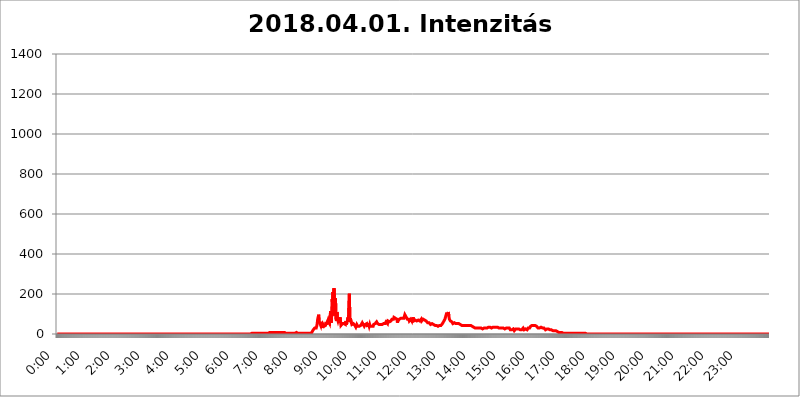
| Category | 2018.04.01. Intenzitás [W/m^2] |
|---|---|
| 0.0 | 0 |
| 0.0006944444444444445 | 0 |
| 0.001388888888888889 | 0 |
| 0.0020833333333333333 | 0 |
| 0.002777777777777778 | 0 |
| 0.003472222222222222 | 0 |
| 0.004166666666666667 | 0 |
| 0.004861111111111111 | 0 |
| 0.005555555555555556 | 0 |
| 0.0062499999999999995 | 0 |
| 0.006944444444444444 | 0 |
| 0.007638888888888889 | 0 |
| 0.008333333333333333 | 0 |
| 0.009027777777777779 | 0 |
| 0.009722222222222222 | 0 |
| 0.010416666666666666 | 0 |
| 0.011111111111111112 | 0 |
| 0.011805555555555555 | 0 |
| 0.012499999999999999 | 0 |
| 0.013194444444444444 | 0 |
| 0.013888888888888888 | 0 |
| 0.014583333333333332 | 0 |
| 0.015277777777777777 | 0 |
| 0.015972222222222224 | 0 |
| 0.016666666666666666 | 0 |
| 0.017361111111111112 | 0 |
| 0.018055555555555557 | 0 |
| 0.01875 | 0 |
| 0.019444444444444445 | 0 |
| 0.02013888888888889 | 0 |
| 0.020833333333333332 | 0 |
| 0.02152777777777778 | 0 |
| 0.022222222222222223 | 0 |
| 0.02291666666666667 | 0 |
| 0.02361111111111111 | 0 |
| 0.024305555555555556 | 0 |
| 0.024999999999999998 | 0 |
| 0.025694444444444447 | 0 |
| 0.02638888888888889 | 0 |
| 0.027083333333333334 | 0 |
| 0.027777777777777776 | 0 |
| 0.02847222222222222 | 0 |
| 0.029166666666666664 | 0 |
| 0.029861111111111113 | 0 |
| 0.030555555555555555 | 0 |
| 0.03125 | 0 |
| 0.03194444444444445 | 0 |
| 0.03263888888888889 | 0 |
| 0.03333333333333333 | 0 |
| 0.034027777777777775 | 0 |
| 0.034722222222222224 | 0 |
| 0.035416666666666666 | 0 |
| 0.036111111111111115 | 0 |
| 0.03680555555555556 | 0 |
| 0.0375 | 0 |
| 0.03819444444444444 | 0 |
| 0.03888888888888889 | 0 |
| 0.03958333333333333 | 0 |
| 0.04027777777777778 | 0 |
| 0.04097222222222222 | 0 |
| 0.041666666666666664 | 0 |
| 0.042361111111111106 | 0 |
| 0.04305555555555556 | 0 |
| 0.043750000000000004 | 0 |
| 0.044444444444444446 | 0 |
| 0.04513888888888889 | 0 |
| 0.04583333333333334 | 0 |
| 0.04652777777777778 | 0 |
| 0.04722222222222222 | 0 |
| 0.04791666666666666 | 0 |
| 0.04861111111111111 | 0 |
| 0.049305555555555554 | 0 |
| 0.049999999999999996 | 0 |
| 0.05069444444444445 | 0 |
| 0.051388888888888894 | 0 |
| 0.052083333333333336 | 0 |
| 0.05277777777777778 | 0 |
| 0.05347222222222222 | 0 |
| 0.05416666666666667 | 0 |
| 0.05486111111111111 | 0 |
| 0.05555555555555555 | 0 |
| 0.05625 | 0 |
| 0.05694444444444444 | 0 |
| 0.057638888888888885 | 0 |
| 0.05833333333333333 | 0 |
| 0.05902777777777778 | 0 |
| 0.059722222222222225 | 0 |
| 0.06041666666666667 | 0 |
| 0.061111111111111116 | 0 |
| 0.06180555555555556 | 0 |
| 0.0625 | 0 |
| 0.06319444444444444 | 0 |
| 0.06388888888888888 | 0 |
| 0.06458333333333334 | 0 |
| 0.06527777777777778 | 0 |
| 0.06597222222222222 | 0 |
| 0.06666666666666667 | 0 |
| 0.06736111111111111 | 0 |
| 0.06805555555555555 | 0 |
| 0.06874999999999999 | 0 |
| 0.06944444444444443 | 0 |
| 0.07013888888888889 | 0 |
| 0.07083333333333333 | 0 |
| 0.07152777777777779 | 0 |
| 0.07222222222222223 | 0 |
| 0.07291666666666667 | 0 |
| 0.07361111111111111 | 0 |
| 0.07430555555555556 | 0 |
| 0.075 | 0 |
| 0.07569444444444444 | 0 |
| 0.0763888888888889 | 0 |
| 0.07708333333333334 | 0 |
| 0.07777777777777778 | 0 |
| 0.07847222222222222 | 0 |
| 0.07916666666666666 | 0 |
| 0.0798611111111111 | 0 |
| 0.08055555555555556 | 0 |
| 0.08125 | 0 |
| 0.08194444444444444 | 0 |
| 0.08263888888888889 | 0 |
| 0.08333333333333333 | 0 |
| 0.08402777777777777 | 0 |
| 0.08472222222222221 | 0 |
| 0.08541666666666665 | 0 |
| 0.08611111111111112 | 0 |
| 0.08680555555555557 | 0 |
| 0.08750000000000001 | 0 |
| 0.08819444444444445 | 0 |
| 0.08888888888888889 | 0 |
| 0.08958333333333333 | 0 |
| 0.09027777777777778 | 0 |
| 0.09097222222222222 | 0 |
| 0.09166666666666667 | 0 |
| 0.09236111111111112 | 0 |
| 0.09305555555555556 | 0 |
| 0.09375 | 0 |
| 0.09444444444444444 | 0 |
| 0.09513888888888888 | 0 |
| 0.09583333333333333 | 0 |
| 0.09652777777777777 | 0 |
| 0.09722222222222222 | 0 |
| 0.09791666666666667 | 0 |
| 0.09861111111111111 | 0 |
| 0.09930555555555555 | 0 |
| 0.09999999999999999 | 0 |
| 0.10069444444444443 | 0 |
| 0.1013888888888889 | 0 |
| 0.10208333333333335 | 0 |
| 0.10277777777777779 | 0 |
| 0.10347222222222223 | 0 |
| 0.10416666666666667 | 0 |
| 0.10486111111111111 | 0 |
| 0.10555555555555556 | 0 |
| 0.10625 | 0 |
| 0.10694444444444444 | 0 |
| 0.1076388888888889 | 0 |
| 0.10833333333333334 | 0 |
| 0.10902777777777778 | 0 |
| 0.10972222222222222 | 0 |
| 0.1111111111111111 | 0 |
| 0.11180555555555556 | 0 |
| 0.11180555555555556 | 0 |
| 0.1125 | 0 |
| 0.11319444444444444 | 0 |
| 0.11388888888888889 | 0 |
| 0.11458333333333333 | 0 |
| 0.11527777777777777 | 0 |
| 0.11597222222222221 | 0 |
| 0.11666666666666665 | 0 |
| 0.1173611111111111 | 0 |
| 0.11805555555555557 | 0 |
| 0.11944444444444445 | 0 |
| 0.12013888888888889 | 0 |
| 0.12083333333333333 | 0 |
| 0.12152777777777778 | 0 |
| 0.12222222222222223 | 0 |
| 0.12291666666666667 | 0 |
| 0.12291666666666667 | 0 |
| 0.12361111111111112 | 0 |
| 0.12430555555555556 | 0 |
| 0.125 | 0 |
| 0.12569444444444444 | 0 |
| 0.12638888888888888 | 0 |
| 0.12708333333333333 | 0 |
| 0.16875 | 0 |
| 0.12847222222222224 | 0 |
| 0.12916666666666668 | 0 |
| 0.12986111111111112 | 0 |
| 0.13055555555555556 | 0 |
| 0.13125 | 0 |
| 0.13194444444444445 | 0 |
| 0.1326388888888889 | 0 |
| 0.13333333333333333 | 0 |
| 0.13402777777777777 | 0 |
| 0.13402777777777777 | 0 |
| 0.13472222222222222 | 0 |
| 0.13541666666666666 | 0 |
| 0.1361111111111111 | 0 |
| 0.13749999999999998 | 0 |
| 0.13819444444444443 | 0 |
| 0.1388888888888889 | 0 |
| 0.13958333333333334 | 0 |
| 0.14027777777777778 | 0 |
| 0.14097222222222222 | 0 |
| 0.14166666666666666 | 0 |
| 0.1423611111111111 | 0 |
| 0.14305555555555557 | 0 |
| 0.14375000000000002 | 0 |
| 0.14444444444444446 | 0 |
| 0.1451388888888889 | 0 |
| 0.1451388888888889 | 0 |
| 0.14652777777777778 | 0 |
| 0.14722222222222223 | 0 |
| 0.14791666666666667 | 0 |
| 0.1486111111111111 | 0 |
| 0.14930555555555555 | 0 |
| 0.15 | 0 |
| 0.15069444444444444 | 0 |
| 0.15138888888888888 | 0 |
| 0.15208333333333332 | 0 |
| 0.15277777777777776 | 0 |
| 0.15347222222222223 | 0 |
| 0.15416666666666667 | 0 |
| 0.15486111111111112 | 0 |
| 0.15555555555555556 | 0 |
| 0.15625 | 0 |
| 0.15694444444444444 | 0 |
| 0.15763888888888888 | 0 |
| 0.15833333333333333 | 0 |
| 0.15902777777777777 | 0 |
| 0.15972222222222224 | 0 |
| 0.16041666666666668 | 0 |
| 0.16111111111111112 | 0 |
| 0.16180555555555556 | 0 |
| 0.1625 | 0 |
| 0.16319444444444445 | 0 |
| 0.1638888888888889 | 0 |
| 0.16458333333333333 | 0 |
| 0.16527777777777777 | 0 |
| 0.16597222222222222 | 0 |
| 0.16666666666666666 | 0 |
| 0.1673611111111111 | 0 |
| 0.16805555555555554 | 0 |
| 0.16874999999999998 | 0 |
| 0.16944444444444443 | 0 |
| 0.17013888888888887 | 0 |
| 0.1708333333333333 | 0 |
| 0.17152777777777775 | 0 |
| 0.17222222222222225 | 0 |
| 0.1729166666666667 | 0 |
| 0.17361111111111113 | 0 |
| 0.17430555555555557 | 0 |
| 0.17500000000000002 | 0 |
| 0.17569444444444446 | 0 |
| 0.1763888888888889 | 0 |
| 0.17708333333333334 | 0 |
| 0.17777777777777778 | 0 |
| 0.17847222222222223 | 0 |
| 0.17916666666666667 | 0 |
| 0.1798611111111111 | 0 |
| 0.18055555555555555 | 0 |
| 0.18125 | 0 |
| 0.18194444444444444 | 0 |
| 0.1826388888888889 | 0 |
| 0.18333333333333335 | 0 |
| 0.1840277777777778 | 0 |
| 0.18472222222222223 | 0 |
| 0.18541666666666667 | 0 |
| 0.18611111111111112 | 0 |
| 0.18680555555555556 | 0 |
| 0.1875 | 0 |
| 0.18819444444444444 | 0 |
| 0.18888888888888888 | 0 |
| 0.18958333333333333 | 0 |
| 0.19027777777777777 | 0 |
| 0.1909722222222222 | 0 |
| 0.19166666666666665 | 0 |
| 0.19236111111111112 | 0 |
| 0.19305555555555554 | 0 |
| 0.19375 | 0 |
| 0.19444444444444445 | 0 |
| 0.1951388888888889 | 0 |
| 0.19583333333333333 | 0 |
| 0.19652777777777777 | 0 |
| 0.19722222222222222 | 0 |
| 0.19791666666666666 | 0 |
| 0.1986111111111111 | 0 |
| 0.19930555555555554 | 0 |
| 0.19999999999999998 | 0 |
| 0.20069444444444443 | 0 |
| 0.20138888888888887 | 0 |
| 0.2020833333333333 | 0 |
| 0.2027777777777778 | 0 |
| 0.2034722222222222 | 0 |
| 0.2041666666666667 | 0 |
| 0.20486111111111113 | 0 |
| 0.20555555555555557 | 0 |
| 0.20625000000000002 | 0 |
| 0.20694444444444446 | 0 |
| 0.2076388888888889 | 0 |
| 0.20833333333333334 | 0 |
| 0.20902777777777778 | 0 |
| 0.20972222222222223 | 0 |
| 0.21041666666666667 | 0 |
| 0.2111111111111111 | 0 |
| 0.21180555555555555 | 0 |
| 0.2125 | 0 |
| 0.21319444444444444 | 0 |
| 0.2138888888888889 | 0 |
| 0.21458333333333335 | 0 |
| 0.2152777777777778 | 0 |
| 0.21597222222222223 | 0 |
| 0.21666666666666667 | 0 |
| 0.21736111111111112 | 0 |
| 0.21805555555555556 | 0 |
| 0.21875 | 0 |
| 0.21944444444444444 | 0 |
| 0.22013888888888888 | 0 |
| 0.22083333333333333 | 0 |
| 0.22152777777777777 | 0 |
| 0.2222222222222222 | 0 |
| 0.22291666666666665 | 0 |
| 0.2236111111111111 | 0 |
| 0.22430555555555556 | 0 |
| 0.225 | 0 |
| 0.22569444444444445 | 0 |
| 0.2263888888888889 | 0 |
| 0.22708333333333333 | 0 |
| 0.22777777777777777 | 0 |
| 0.22847222222222222 | 0 |
| 0.22916666666666666 | 0 |
| 0.2298611111111111 | 0 |
| 0.23055555555555554 | 0 |
| 0.23124999999999998 | 0 |
| 0.23194444444444443 | 0 |
| 0.23263888888888887 | 0 |
| 0.2333333333333333 | 0 |
| 0.2340277777777778 | 0 |
| 0.2347222222222222 | 0 |
| 0.2354166666666667 | 0 |
| 0.23611111111111113 | 0 |
| 0.23680555555555557 | 0 |
| 0.23750000000000002 | 0 |
| 0.23819444444444446 | 0 |
| 0.2388888888888889 | 0 |
| 0.23958333333333334 | 0 |
| 0.24027777777777778 | 0 |
| 0.24097222222222223 | 0 |
| 0.24166666666666667 | 0 |
| 0.2423611111111111 | 0 |
| 0.24305555555555555 | 0 |
| 0.24375 | 0 |
| 0.24444444444444446 | 0 |
| 0.24513888888888888 | 0 |
| 0.24583333333333335 | 0 |
| 0.2465277777777778 | 0 |
| 0.24722222222222223 | 0 |
| 0.24791666666666667 | 0 |
| 0.24861111111111112 | 0 |
| 0.24930555555555556 | 0 |
| 0.25 | 0 |
| 0.25069444444444444 | 0 |
| 0.2513888888888889 | 0 |
| 0.2520833333333333 | 0 |
| 0.25277777777777777 | 0 |
| 0.2534722222222222 | 0 |
| 0.25416666666666665 | 0 |
| 0.2548611111111111 | 0 |
| 0.2555555555555556 | 0 |
| 0.25625000000000003 | 0 |
| 0.2569444444444445 | 0 |
| 0.2576388888888889 | 0 |
| 0.25833333333333336 | 0 |
| 0.2590277777777778 | 0 |
| 0.25972222222222224 | 0 |
| 0.2604166666666667 | 0 |
| 0.2611111111111111 | 0 |
| 0.26180555555555557 | 0 |
| 0.2625 | 0 |
| 0.26319444444444445 | 0 |
| 0.2638888888888889 | 0 |
| 0.26458333333333334 | 0 |
| 0.2652777777777778 | 0 |
| 0.2659722222222222 | 0 |
| 0.26666666666666666 | 0 |
| 0.2673611111111111 | 0 |
| 0.26805555555555555 | 0 |
| 0.26875 | 0 |
| 0.26944444444444443 | 0 |
| 0.2701388888888889 | 0 |
| 0.2708333333333333 | 0 |
| 0.27152777777777776 | 0 |
| 0.2722222222222222 | 3.525 |
| 0.27291666666666664 | 3.525 |
| 0.2736111111111111 | 0 |
| 0.2743055555555555 | 3.525 |
| 0.27499999999999997 | 3.525 |
| 0.27569444444444446 | 3.525 |
| 0.27638888888888885 | 3.525 |
| 0.27708333333333335 | 3.525 |
| 0.2777777777777778 | 3.525 |
| 0.27847222222222223 | 3.525 |
| 0.2791666666666667 | 3.525 |
| 0.2798611111111111 | 3.525 |
| 0.28055555555555556 | 3.525 |
| 0.28125 | 3.525 |
| 0.28194444444444444 | 3.525 |
| 0.2826388888888889 | 3.525 |
| 0.2833333333333333 | 3.525 |
| 0.28402777777777777 | 3.525 |
| 0.2847222222222222 | 3.525 |
| 0.28541666666666665 | 3.525 |
| 0.28611111111111115 | 3.525 |
| 0.28680555555555554 | 3.525 |
| 0.28750000000000003 | 3.525 |
| 0.2881944444444445 | 3.525 |
| 0.2888888888888889 | 3.525 |
| 0.28958333333333336 | 3.525 |
| 0.2902777777777778 | 3.525 |
| 0.29097222222222224 | 3.525 |
| 0.2916666666666667 | 3.525 |
| 0.2923611111111111 | 3.525 |
| 0.29305555555555557 | 3.525 |
| 0.29375 | 3.525 |
| 0.29444444444444445 | 3.525 |
| 0.2951388888888889 | 3.525 |
| 0.29583333333333334 | 3.525 |
| 0.2965277777777778 | 3.525 |
| 0.2972222222222222 | 3.525 |
| 0.29791666666666666 | 7.887 |
| 0.2986111111111111 | 7.887 |
| 0.29930555555555555 | 7.887 |
| 0.3 | 7.887 |
| 0.30069444444444443 | 7.887 |
| 0.3013888888888889 | 7.887 |
| 0.3020833333333333 | 7.887 |
| 0.30277777777777776 | 7.887 |
| 0.3034722222222222 | 7.887 |
| 0.30416666666666664 | 7.887 |
| 0.3048611111111111 | 7.887 |
| 0.3055555555555555 | 7.887 |
| 0.30624999999999997 | 7.887 |
| 0.3069444444444444 | 7.887 |
| 0.3076388888888889 | 7.887 |
| 0.30833333333333335 | 7.887 |
| 0.3090277777777778 | 7.887 |
| 0.30972222222222223 | 7.887 |
| 0.3104166666666667 | 7.887 |
| 0.3111111111111111 | 7.887 |
| 0.31180555555555556 | 7.887 |
| 0.3125 | 7.887 |
| 0.31319444444444444 | 3.525 |
| 0.3138888888888889 | 7.887 |
| 0.3145833333333333 | 7.887 |
| 0.31527777777777777 | 7.887 |
| 0.3159722222222222 | 7.887 |
| 0.31666666666666665 | 7.887 |
| 0.31736111111111115 | 3.525 |
| 0.31805555555555554 | 7.887 |
| 0.31875000000000003 | 7.887 |
| 0.3194444444444445 | 7.887 |
| 0.3201388888888889 | 7.887 |
| 0.32083333333333336 | 3.525 |
| 0.3215277777777778 | 3.525 |
| 0.32222222222222224 | 3.525 |
| 0.3229166666666667 | 3.525 |
| 0.3236111111111111 | 3.525 |
| 0.32430555555555557 | 3.525 |
| 0.325 | 3.525 |
| 0.32569444444444445 | 3.525 |
| 0.3263888888888889 | 3.525 |
| 0.32708333333333334 | 3.525 |
| 0.3277777777777778 | 3.525 |
| 0.3284722222222222 | 3.525 |
| 0.32916666666666666 | 3.525 |
| 0.3298611111111111 | 3.525 |
| 0.33055555555555555 | 3.525 |
| 0.33125 | 3.525 |
| 0.33194444444444443 | 3.525 |
| 0.3326388888888889 | 7.887 |
| 0.3333333333333333 | 3.525 |
| 0.3340277777777778 | 7.887 |
| 0.3347222222222222 | 7.887 |
| 0.3354166666666667 | 7.887 |
| 0.3361111111111111 | 3.525 |
| 0.3368055555555556 | 3.525 |
| 0.33749999999999997 | 3.525 |
| 0.33819444444444446 | 3.525 |
| 0.33888888888888885 | 3.525 |
| 0.33958333333333335 | 3.525 |
| 0.34027777777777773 | 3.525 |
| 0.34097222222222223 | 3.525 |
| 0.3416666666666666 | 3.525 |
| 0.3423611111111111 | 3.525 |
| 0.3430555555555555 | 3.525 |
| 0.34375 | 3.525 |
| 0.3444444444444445 | 3.525 |
| 0.3451388888888889 | 3.525 |
| 0.3458333333333334 | 3.525 |
| 0.34652777777777777 | 3.525 |
| 0.34722222222222227 | 3.525 |
| 0.34791666666666665 | 3.525 |
| 0.34861111111111115 | 3.525 |
| 0.34930555555555554 | 3.525 |
| 0.35000000000000003 | 3.525 |
| 0.3506944444444444 | 3.525 |
| 0.3513888888888889 | 3.525 |
| 0.3520833333333333 | 3.525 |
| 0.3527777777777778 | 0 |
| 0.3534722222222222 | 3.525 |
| 0.3541666666666667 | 3.525 |
| 0.3548611111111111 | 3.525 |
| 0.35555555555555557 | 3.525 |
| 0.35625 | 3.525 |
| 0.35694444444444445 | 7.887 |
| 0.3576388888888889 | 12.257 |
| 0.35833333333333334 | 16.636 |
| 0.3590277777777778 | 21.024 |
| 0.3597222222222222 | 25.419 |
| 0.36041666666666666 | 25.419 |
| 0.3611111111111111 | 29.823 |
| 0.36180555555555555 | 29.823 |
| 0.3625 | 34.234 |
| 0.36319444444444443 | 29.823 |
| 0.3638888888888889 | 38.653 |
| 0.3645833333333333 | 51.951 |
| 0.3652777777777778 | 74.246 |
| 0.3659722222222222 | 78.722 |
| 0.3666666666666667 | 96.682 |
| 0.3673611111111111 | 60.85 |
| 0.3680555555555556 | 56.398 |
| 0.36874999999999997 | 56.398 |
| 0.36944444444444446 | 43.079 |
| 0.37013888888888885 | 60.85 |
| 0.37083333333333335 | 47.511 |
| 0.37152777777777773 | 38.653 |
| 0.37222222222222223 | 29.823 |
| 0.3729166666666666 | 47.511 |
| 0.3736111111111111 | 51.951 |
| 0.3743055555555555 | 38.653 |
| 0.375 | 38.653 |
| 0.3756944444444445 | 38.653 |
| 0.3763888888888889 | 43.079 |
| 0.3770833333333334 | 60.85 |
| 0.37777777777777777 | 47.511 |
| 0.37847222222222227 | 47.511 |
| 0.37916666666666665 | 47.511 |
| 0.37986111111111115 | 69.775 |
| 0.38055555555555554 | 60.85 |
| 0.38125000000000003 | 60.85 |
| 0.3819444444444444 | 51.951 |
| 0.3826388888888889 | 56.398 |
| 0.3833333333333333 | 114.716 |
| 0.3840277777777778 | 56.398 |
| 0.3847222222222222 | 69.775 |
| 0.3854166666666667 | 173.709 |
| 0.3861111111111111 | 155.509 |
| 0.38680555555555557 | 210.182 |
| 0.3875 | 105.69 |
| 0.38819444444444445 | 228.436 |
| 0.3888888888888889 | 92.184 |
| 0.38958333333333334 | 92.184 |
| 0.3902777777777778 | 178.264 |
| 0.3909722222222222 | 74.246 |
| 0.39166666666666666 | 65.31 |
| 0.3923611111111111 | 110.201 |
| 0.39305555555555555 | 74.246 |
| 0.39375 | 65.31 |
| 0.39444444444444443 | 74.246 |
| 0.3951388888888889 | 56.398 |
| 0.3958333333333333 | 56.398 |
| 0.3965277777777778 | 83.205 |
| 0.3972222222222222 | 69.775 |
| 0.3979166666666667 | 43.079 |
| 0.3986111111111111 | 38.653 |
| 0.3993055555555556 | 38.653 |
| 0.39999999999999997 | 51.951 |
| 0.40069444444444446 | 47.511 |
| 0.40138888888888885 | 47.511 |
| 0.40208333333333335 | 51.951 |
| 0.40277777777777773 | 47.511 |
| 0.40347222222222223 | 51.951 |
| 0.4041666666666666 | 47.511 |
| 0.4048611111111111 | 65.31 |
| 0.4055555555555555 | 47.511 |
| 0.40625 | 56.398 |
| 0.4069444444444445 | 65.31 |
| 0.4076388888888889 | 83.205 |
| 0.4083333333333334 | 60.85 |
| 0.40902777777777777 | 56.398 |
| 0.40972222222222227 | 201.058 |
| 0.41041666666666665 | 69.775 |
| 0.41111111111111115 | 78.722 |
| 0.41180555555555554 | 74.246 |
| 0.41250000000000003 | 56.398 |
| 0.4131944444444444 | 47.511 |
| 0.4138888888888889 | 47.511 |
| 0.4145833333333333 | 43.079 |
| 0.4152777777777778 | 51.951 |
| 0.4159722222222222 | 56.398 |
| 0.4166666666666667 | 47.511 |
| 0.4173611111111111 | 43.079 |
| 0.41805555555555557 | 38.653 |
| 0.41875 | 34.234 |
| 0.41944444444444445 | 38.653 |
| 0.4201388888888889 | 47.511 |
| 0.42083333333333334 | 51.951 |
| 0.4215277777777778 | 38.653 |
| 0.4222222222222222 | 38.653 |
| 0.42291666666666666 | 38.653 |
| 0.4236111111111111 | 38.653 |
| 0.42430555555555555 | 34.234 |
| 0.425 | 38.653 |
| 0.42569444444444443 | 43.079 |
| 0.4263888888888889 | 43.079 |
| 0.4270833333333333 | 43.079 |
| 0.4277777777777778 | 56.398 |
| 0.4284722222222222 | 51.951 |
| 0.4291666666666667 | 47.511 |
| 0.4298611111111111 | 43.079 |
| 0.4305555555555556 | 38.653 |
| 0.43124999999999997 | 43.079 |
| 0.43194444444444446 | 47.511 |
| 0.43263888888888885 | 47.511 |
| 0.43333333333333335 | 47.511 |
| 0.43402777777777773 | 51.951 |
| 0.43472222222222223 | 43.079 |
| 0.4354166666666666 | 47.511 |
| 0.4361111111111111 | 47.511 |
| 0.4368055555555555 | 47.511 |
| 0.4375 | 38.653 |
| 0.4381944444444445 | 47.511 |
| 0.4388888888888889 | 38.653 |
| 0.4395833333333334 | 38.653 |
| 0.44027777777777777 | 43.079 |
| 0.44097222222222227 | 38.653 |
| 0.44166666666666665 | 38.653 |
| 0.44236111111111115 | 34.234 |
| 0.44305555555555554 | 38.653 |
| 0.44375000000000003 | 47.511 |
| 0.4444444444444444 | 51.951 |
| 0.4451388888888889 | 51.951 |
| 0.4458333333333333 | 51.951 |
| 0.4465277777777778 | 51.951 |
| 0.4472222222222222 | 51.951 |
| 0.4479166666666667 | 60.85 |
| 0.4486111111111111 | 60.85 |
| 0.44930555555555557 | 51.951 |
| 0.45 | 47.511 |
| 0.45069444444444445 | 47.511 |
| 0.4513888888888889 | 47.511 |
| 0.45208333333333334 | 43.079 |
| 0.4527777777777778 | 47.511 |
| 0.4534722222222222 | 47.511 |
| 0.45416666666666666 | 47.511 |
| 0.4548611111111111 | 47.511 |
| 0.45555555555555555 | 47.511 |
| 0.45625 | 43.079 |
| 0.45694444444444443 | 47.511 |
| 0.4576388888888889 | 51.951 |
| 0.4583333333333333 | 51.951 |
| 0.4590277777777778 | 56.398 |
| 0.4597222222222222 | 51.951 |
| 0.4604166666666667 | 51.951 |
| 0.4611111111111111 | 60.85 |
| 0.4618055555555556 | 65.31 |
| 0.46249999999999997 | 56.398 |
| 0.46319444444444446 | 51.951 |
| 0.46388888888888885 | 65.31 |
| 0.46458333333333335 | 60.85 |
| 0.46527777777777773 | 65.31 |
| 0.46597222222222223 | 60.85 |
| 0.4666666666666666 | 60.85 |
| 0.4673611111111111 | 56.398 |
| 0.4680555555555555 | 65.31 |
| 0.46875 | 69.775 |
| 0.4694444444444445 | 74.246 |
| 0.4701388888888889 | 78.722 |
| 0.4708333333333334 | 78.722 |
| 0.47152777777777777 | 74.246 |
| 0.47222222222222227 | 83.205 |
| 0.47291666666666665 | 83.205 |
| 0.47361111111111115 | 78.722 |
| 0.47430555555555554 | 78.722 |
| 0.47500000000000003 | 83.205 |
| 0.4756944444444444 | 78.722 |
| 0.4763888888888889 | 74.246 |
| 0.4770833333333333 | 56.398 |
| 0.4777777777777778 | 65.31 |
| 0.4784722222222222 | 69.775 |
| 0.4791666666666667 | 69.775 |
| 0.4798611111111111 | 74.246 |
| 0.48055555555555557 | 74.246 |
| 0.48125 | 74.246 |
| 0.48194444444444445 | 78.722 |
| 0.4826388888888889 | 83.205 |
| 0.48333333333333334 | 83.205 |
| 0.4840277777777778 | 78.722 |
| 0.4847222222222222 | 83.205 |
| 0.48541666666666666 | 78.722 |
| 0.4861111111111111 | 78.722 |
| 0.48680555555555555 | 87.692 |
| 0.4875 | 96.682 |
| 0.48819444444444443 | 92.184 |
| 0.4888888888888889 | 87.692 |
| 0.4895833333333333 | 87.692 |
| 0.4902777777777778 | 83.205 |
| 0.4909722222222222 | 74.246 |
| 0.4916666666666667 | 74.246 |
| 0.4923611111111111 | 74.246 |
| 0.4930555555555556 | 74.246 |
| 0.49374999999999997 | 65.31 |
| 0.49444444444444446 | 69.775 |
| 0.49513888888888885 | 69.775 |
| 0.49583333333333335 | 74.246 |
| 0.49652777777777773 | 69.775 |
| 0.49722222222222223 | 65.31 |
| 0.4979166666666666 | 78.722 |
| 0.4986111111111111 | 69.775 |
| 0.4993055555555555 | 83.205 |
| 0.5 | 65.31 |
| 0.5006944444444444 | 69.775 |
| 0.5013888888888889 | 65.31 |
| 0.5020833333333333 | 69.775 |
| 0.5027777777777778 | 69.775 |
| 0.5034722222222222 | 65.31 |
| 0.5041666666666667 | 65.31 |
| 0.5048611111111111 | 65.31 |
| 0.5055555555555555 | 65.31 |
| 0.50625 | 69.775 |
| 0.5069444444444444 | 65.31 |
| 0.5076388888888889 | 65.31 |
| 0.5083333333333333 | 65.31 |
| 0.5090277777777777 | 69.775 |
| 0.5097222222222222 | 69.775 |
| 0.5104166666666666 | 74.246 |
| 0.5111111111111112 | 65.31 |
| 0.5118055555555555 | 65.31 |
| 0.5125000000000001 | 69.775 |
| 0.5131944444444444 | 74.246 |
| 0.513888888888889 | 74.246 |
| 0.5145833333333333 | 74.246 |
| 0.5152777777777778 | 69.775 |
| 0.5159722222222222 | 69.775 |
| 0.5166666666666667 | 65.31 |
| 0.517361111111111 | 65.31 |
| 0.5180555555555556 | 65.31 |
| 0.5187499999999999 | 60.85 |
| 0.5194444444444445 | 56.398 |
| 0.5201388888888888 | 51.951 |
| 0.5208333333333334 | 56.398 |
| 0.5215277777777778 | 56.398 |
| 0.5222222222222223 | 51.951 |
| 0.5229166666666667 | 51.951 |
| 0.5236111111111111 | 47.511 |
| 0.5243055555555556 | 47.511 |
| 0.525 | 47.511 |
| 0.5256944444444445 | 51.951 |
| 0.5263888888888889 | 47.511 |
| 0.5270833333333333 | 47.511 |
| 0.5277777777777778 | 47.511 |
| 0.5284722222222222 | 47.511 |
| 0.5291666666666667 | 43.079 |
| 0.5298611111111111 | 43.079 |
| 0.5305555555555556 | 47.511 |
| 0.53125 | 43.079 |
| 0.5319444444444444 | 43.079 |
| 0.5326388888888889 | 43.079 |
| 0.5333333333333333 | 43.079 |
| 0.5340277777777778 | 38.653 |
| 0.5347222222222222 | 38.653 |
| 0.5354166666666667 | 43.079 |
| 0.5361111111111111 | 43.079 |
| 0.5368055555555555 | 43.079 |
| 0.5375 | 43.079 |
| 0.5381944444444444 | 43.079 |
| 0.5388888888888889 | 47.511 |
| 0.5395833333333333 | 47.511 |
| 0.5402777777777777 | 51.951 |
| 0.5409722222222222 | 56.398 |
| 0.5416666666666666 | 56.398 |
| 0.5423611111111112 | 65.31 |
| 0.5430555555555555 | 69.775 |
| 0.5437500000000001 | 74.246 |
| 0.5444444444444444 | 83.205 |
| 0.545138888888889 | 92.184 |
| 0.5458333333333333 | 101.184 |
| 0.5465277777777778 | 105.69 |
| 0.5472222222222222 | 105.69 |
| 0.5479166666666667 | 101.184 |
| 0.548611111111111 | 110.201 |
| 0.5493055555555556 | 87.692 |
| 0.5499999999999999 | 74.246 |
| 0.5506944444444445 | 74.246 |
| 0.5513888888888888 | 65.31 |
| 0.5520833333333334 | 60.85 |
| 0.5527777777777778 | 60.85 |
| 0.5534722222222223 | 60.85 |
| 0.5541666666666667 | 60.85 |
| 0.5548611111111111 | 51.951 |
| 0.5555555555555556 | 56.398 |
| 0.55625 | 56.398 |
| 0.5569444444444445 | 56.398 |
| 0.5576388888888889 | 56.398 |
| 0.5583333333333333 | 56.398 |
| 0.5590277777777778 | 51.951 |
| 0.5597222222222222 | 51.951 |
| 0.5604166666666667 | 51.951 |
| 0.5611111111111111 | 51.951 |
| 0.5618055555555556 | 51.951 |
| 0.5625 | 51.951 |
| 0.5631944444444444 | 51.951 |
| 0.5638888888888889 | 47.511 |
| 0.5645833333333333 | 47.511 |
| 0.5652777777777778 | 47.511 |
| 0.5659722222222222 | 47.511 |
| 0.5666666666666667 | 47.511 |
| 0.5673611111111111 | 43.079 |
| 0.5680555555555555 | 43.079 |
| 0.56875 | 43.079 |
| 0.5694444444444444 | 43.079 |
| 0.5701388888888889 | 43.079 |
| 0.5708333333333333 | 43.079 |
| 0.5715277777777777 | 43.079 |
| 0.5722222222222222 | 43.079 |
| 0.5729166666666666 | 43.079 |
| 0.5736111111111112 | 43.079 |
| 0.5743055555555555 | 43.079 |
| 0.5750000000000001 | 43.079 |
| 0.5756944444444444 | 43.079 |
| 0.576388888888889 | 43.079 |
| 0.5770833333333333 | 43.079 |
| 0.5777777777777778 | 43.079 |
| 0.5784722222222222 | 43.079 |
| 0.5791666666666667 | 43.079 |
| 0.579861111111111 | 43.079 |
| 0.5805555555555556 | 43.079 |
| 0.5812499999999999 | 38.653 |
| 0.5819444444444445 | 38.653 |
| 0.5826388888888888 | 38.653 |
| 0.5833333333333334 | 34.234 |
| 0.5840277777777778 | 34.234 |
| 0.5847222222222223 | 29.823 |
| 0.5854166666666667 | 29.823 |
| 0.5861111111111111 | 29.823 |
| 0.5868055555555556 | 29.823 |
| 0.5875 | 29.823 |
| 0.5881944444444445 | 29.823 |
| 0.5888888888888889 | 25.419 |
| 0.5895833333333333 | 29.823 |
| 0.5902777777777778 | 29.823 |
| 0.5909722222222222 | 29.823 |
| 0.5916666666666667 | 29.823 |
| 0.5923611111111111 | 29.823 |
| 0.5930555555555556 | 29.823 |
| 0.59375 | 29.823 |
| 0.5944444444444444 | 29.823 |
| 0.5951388888888889 | 29.823 |
| 0.5958333333333333 | 25.419 |
| 0.5965277777777778 | 25.419 |
| 0.5972222222222222 | 29.823 |
| 0.5979166666666667 | 29.823 |
| 0.5986111111111111 | 29.823 |
| 0.5993055555555555 | 29.823 |
| 0.6 | 29.823 |
| 0.6006944444444444 | 29.823 |
| 0.6013888888888889 | 29.823 |
| 0.6020833333333333 | 29.823 |
| 0.6027777777777777 | 29.823 |
| 0.6034722222222222 | 29.823 |
| 0.6041666666666666 | 29.823 |
| 0.6048611111111112 | 34.234 |
| 0.6055555555555555 | 34.234 |
| 0.6062500000000001 | 34.234 |
| 0.6069444444444444 | 34.234 |
| 0.607638888888889 | 34.234 |
| 0.6083333333333333 | 34.234 |
| 0.6090277777777778 | 29.823 |
| 0.6097222222222222 | 29.823 |
| 0.6104166666666667 | 34.234 |
| 0.611111111111111 | 34.234 |
| 0.6118055555555556 | 34.234 |
| 0.6124999999999999 | 34.234 |
| 0.6131944444444445 | 34.234 |
| 0.6138888888888888 | 34.234 |
| 0.6145833333333334 | 34.234 |
| 0.6152777777777778 | 34.234 |
| 0.6159722222222223 | 34.234 |
| 0.6166666666666667 | 34.234 |
| 0.6173611111111111 | 34.234 |
| 0.6180555555555556 | 29.823 |
| 0.61875 | 29.823 |
| 0.6194444444444445 | 29.823 |
| 0.6201388888888889 | 29.823 |
| 0.6208333333333333 | 29.823 |
| 0.6215277777777778 | 29.823 |
| 0.6222222222222222 | 29.823 |
| 0.6229166666666667 | 29.823 |
| 0.6236111111111111 | 29.823 |
| 0.6243055555555556 | 29.823 |
| 0.625 | 29.823 |
| 0.6256944444444444 | 29.823 |
| 0.6263888888888889 | 29.823 |
| 0.6270833333333333 | 25.419 |
| 0.6277777777777778 | 25.419 |
| 0.6284722222222222 | 25.419 |
| 0.6291666666666667 | 25.419 |
| 0.6298611111111111 | 29.823 |
| 0.6305555555555555 | 25.419 |
| 0.63125 | 29.823 |
| 0.6319444444444444 | 29.823 |
| 0.6326388888888889 | 29.823 |
| 0.6333333333333333 | 29.823 |
| 0.6340277777777777 | 29.823 |
| 0.6347222222222222 | 25.419 |
| 0.6354166666666666 | 21.024 |
| 0.6361111111111112 | 21.024 |
| 0.6368055555555555 | 16.636 |
| 0.6375000000000001 | 21.024 |
| 0.6381944444444444 | 21.024 |
| 0.638888888888889 | 25.419 |
| 0.6395833333333333 | 25.419 |
| 0.6402777777777778 | 21.024 |
| 0.6409722222222222 | 16.636 |
| 0.6416666666666667 | 21.024 |
| 0.642361111111111 | 21.024 |
| 0.6430555555555556 | 25.419 |
| 0.6437499999999999 | 25.419 |
| 0.6444444444444445 | 25.419 |
| 0.6451388888888888 | 25.419 |
| 0.6458333333333334 | 29.823 |
| 0.6465277777777778 | 29.823 |
| 0.6472222222222223 | 25.419 |
| 0.6479166666666667 | 21.024 |
| 0.6486111111111111 | 21.024 |
| 0.6493055555555556 | 21.024 |
| 0.65 | 25.419 |
| 0.6506944444444445 | 21.024 |
| 0.6513888888888889 | 21.024 |
| 0.6520833333333333 | 21.024 |
| 0.6527777777777778 | 25.419 |
| 0.6534722222222222 | 29.823 |
| 0.6541666666666667 | 25.419 |
| 0.6548611111111111 | 21.024 |
| 0.6555555555555556 | 21.024 |
| 0.65625 | 25.419 |
| 0.6569444444444444 | 25.419 |
| 0.6576388888888889 | 21.024 |
| 0.6583333333333333 | 21.024 |
| 0.6590277777777778 | 21.024 |
| 0.6597222222222222 | 25.419 |
| 0.6604166666666667 | 29.823 |
| 0.6611111111111111 | 29.823 |
| 0.6618055555555555 | 29.823 |
| 0.6625 | 29.823 |
| 0.6631944444444444 | 34.234 |
| 0.6638888888888889 | 38.653 |
| 0.6645833333333333 | 38.653 |
| 0.6652777777777777 | 43.079 |
| 0.6659722222222222 | 43.079 |
| 0.6666666666666666 | 43.079 |
| 0.6673611111111111 | 43.079 |
| 0.6680555555555556 | 43.079 |
| 0.6687500000000001 | 43.079 |
| 0.6694444444444444 | 43.079 |
| 0.6701388888888888 | 43.079 |
| 0.6708333333333334 | 43.079 |
| 0.6715277777777778 | 38.653 |
| 0.6722222222222222 | 38.653 |
| 0.6729166666666666 | 38.653 |
| 0.6736111111111112 | 34.234 |
| 0.6743055555555556 | 29.823 |
| 0.6749999999999999 | 29.823 |
| 0.6756944444444444 | 29.823 |
| 0.6763888888888889 | 29.823 |
| 0.6770833333333334 | 29.823 |
| 0.6777777777777777 | 34.234 |
| 0.6784722222222223 | 34.234 |
| 0.6791666666666667 | 29.823 |
| 0.6798611111111111 | 29.823 |
| 0.6805555555555555 | 29.823 |
| 0.68125 | 29.823 |
| 0.6819444444444445 | 29.823 |
| 0.6826388888888889 | 29.823 |
| 0.6833333333333332 | 29.823 |
| 0.6840277777777778 | 25.419 |
| 0.6847222222222222 | 21.024 |
| 0.6854166666666667 | 21.024 |
| 0.686111111111111 | 25.419 |
| 0.6868055555555556 | 25.419 |
| 0.6875 | 25.419 |
| 0.6881944444444444 | 25.419 |
| 0.688888888888889 | 25.419 |
| 0.6895833333333333 | 25.419 |
| 0.6902777777777778 | 21.024 |
| 0.6909722222222222 | 21.024 |
| 0.6916666666666668 | 21.024 |
| 0.6923611111111111 | 21.024 |
| 0.6930555555555555 | 21.024 |
| 0.69375 | 21.024 |
| 0.6944444444444445 | 21.024 |
| 0.6951388888888889 | 16.636 |
| 0.6958333333333333 | 16.636 |
| 0.6965277777777777 | 16.636 |
| 0.6972222222222223 | 16.636 |
| 0.6979166666666666 | 16.636 |
| 0.6986111111111111 | 16.636 |
| 0.6993055555555556 | 16.636 |
| 0.7000000000000001 | 12.257 |
| 0.7006944444444444 | 12.257 |
| 0.7013888888888888 | 12.257 |
| 0.7020833333333334 | 12.257 |
| 0.7027777777777778 | 7.887 |
| 0.7034722222222222 | 7.887 |
| 0.7041666666666666 | 7.887 |
| 0.7048611111111112 | 7.887 |
| 0.7055555555555556 | 7.887 |
| 0.7062499999999999 | 7.887 |
| 0.7069444444444444 | 7.887 |
| 0.7076388888888889 | 7.887 |
| 0.7083333333333334 | 7.887 |
| 0.7090277777777777 | 7.887 |
| 0.7097222222222223 | 3.525 |
| 0.7104166666666667 | 3.525 |
| 0.7111111111111111 | 3.525 |
| 0.7118055555555555 | 3.525 |
| 0.7125 | 3.525 |
| 0.7131944444444445 | 3.525 |
| 0.7138888888888889 | 3.525 |
| 0.7145833333333332 | 3.525 |
| 0.7152777777777778 | 3.525 |
| 0.7159722222222222 | 3.525 |
| 0.7166666666666667 | 3.525 |
| 0.717361111111111 | 3.525 |
| 0.7180555555555556 | 3.525 |
| 0.71875 | 3.525 |
| 0.7194444444444444 | 3.525 |
| 0.720138888888889 | 3.525 |
| 0.7208333333333333 | 3.525 |
| 0.7215277777777778 | 3.525 |
| 0.7222222222222222 | 3.525 |
| 0.7229166666666668 | 3.525 |
| 0.7236111111111111 | 3.525 |
| 0.7243055555555555 | 3.525 |
| 0.725 | 3.525 |
| 0.7256944444444445 | 3.525 |
| 0.7263888888888889 | 3.525 |
| 0.7270833333333333 | 3.525 |
| 0.7277777777777777 | 3.525 |
| 0.7284722222222223 | 3.525 |
| 0.7291666666666666 | 3.525 |
| 0.7298611111111111 | 3.525 |
| 0.7305555555555556 | 3.525 |
| 0.7312500000000001 | 3.525 |
| 0.7319444444444444 | 3.525 |
| 0.7326388888888888 | 3.525 |
| 0.7333333333333334 | 3.525 |
| 0.7340277777777778 | 3.525 |
| 0.7347222222222222 | 3.525 |
| 0.7354166666666666 | 3.525 |
| 0.7361111111111112 | 3.525 |
| 0.7368055555555556 | 3.525 |
| 0.7374999999999999 | 3.525 |
| 0.7381944444444444 | 3.525 |
| 0.7388888888888889 | 3.525 |
| 0.7395833333333334 | 3.525 |
| 0.7402777777777777 | 3.525 |
| 0.7409722222222223 | 3.525 |
| 0.7416666666666667 | 3.525 |
| 0.7423611111111111 | 3.525 |
| 0.7430555555555555 | 0 |
| 0.74375 | 0 |
| 0.7444444444444445 | 0 |
| 0.7451388888888889 | 0 |
| 0.7458333333333332 | 0 |
| 0.7465277777777778 | 0 |
| 0.7472222222222222 | 0 |
| 0.7479166666666667 | 0 |
| 0.748611111111111 | 0 |
| 0.7493055555555556 | 0 |
| 0.75 | 0 |
| 0.7506944444444444 | 0 |
| 0.751388888888889 | 0 |
| 0.7520833333333333 | 0 |
| 0.7527777777777778 | 0 |
| 0.7534722222222222 | 0 |
| 0.7541666666666668 | 0 |
| 0.7548611111111111 | 0 |
| 0.7555555555555555 | 0 |
| 0.75625 | 0 |
| 0.7569444444444445 | 0 |
| 0.7576388888888889 | 0 |
| 0.7583333333333333 | 0 |
| 0.7590277777777777 | 0 |
| 0.7597222222222223 | 0 |
| 0.7604166666666666 | 0 |
| 0.7611111111111111 | 0 |
| 0.7618055555555556 | 0 |
| 0.7625000000000001 | 0 |
| 0.7631944444444444 | 0 |
| 0.7638888888888888 | 0 |
| 0.7645833333333334 | 0 |
| 0.7652777777777778 | 0 |
| 0.7659722222222222 | 0 |
| 0.7666666666666666 | 0 |
| 0.7673611111111112 | 0 |
| 0.7680555555555556 | 0 |
| 0.7687499999999999 | 0 |
| 0.7694444444444444 | 0 |
| 0.7701388888888889 | 0 |
| 0.7708333333333334 | 0 |
| 0.7715277777777777 | 0 |
| 0.7722222222222223 | 0 |
| 0.7729166666666667 | 0 |
| 0.7736111111111111 | 0 |
| 0.7743055555555555 | 0 |
| 0.775 | 0 |
| 0.7756944444444445 | 0 |
| 0.7763888888888889 | 0 |
| 0.7770833333333332 | 0 |
| 0.7777777777777778 | 0 |
| 0.7784722222222222 | 0 |
| 0.7791666666666667 | 0 |
| 0.779861111111111 | 0 |
| 0.7805555555555556 | 0 |
| 0.78125 | 0 |
| 0.7819444444444444 | 0 |
| 0.782638888888889 | 0 |
| 0.7833333333333333 | 0 |
| 0.7840277777777778 | 0 |
| 0.7847222222222222 | 0 |
| 0.7854166666666668 | 0 |
| 0.7861111111111111 | 0 |
| 0.7868055555555555 | 0 |
| 0.7875 | 0 |
| 0.7881944444444445 | 0 |
| 0.7888888888888889 | 0 |
| 0.7895833333333333 | 0 |
| 0.7902777777777777 | 0 |
| 0.7909722222222223 | 0 |
| 0.7916666666666666 | 0 |
| 0.7923611111111111 | 0 |
| 0.7930555555555556 | 0 |
| 0.7937500000000001 | 0 |
| 0.7944444444444444 | 0 |
| 0.7951388888888888 | 0 |
| 0.7958333333333334 | 0 |
| 0.7965277777777778 | 0 |
| 0.7972222222222222 | 0 |
| 0.7979166666666666 | 0 |
| 0.7986111111111112 | 0 |
| 0.7993055555555556 | 0 |
| 0.7999999999999999 | 0 |
| 0.8006944444444444 | 0 |
| 0.8013888888888889 | 0 |
| 0.8020833333333334 | 0 |
| 0.8027777777777777 | 0 |
| 0.8034722222222223 | 0 |
| 0.8041666666666667 | 0 |
| 0.8048611111111111 | 0 |
| 0.8055555555555555 | 0 |
| 0.80625 | 0 |
| 0.8069444444444445 | 0 |
| 0.8076388888888889 | 0 |
| 0.8083333333333332 | 0 |
| 0.8090277777777778 | 0 |
| 0.8097222222222222 | 0 |
| 0.8104166666666667 | 0 |
| 0.811111111111111 | 0 |
| 0.8118055555555556 | 0 |
| 0.8125 | 0 |
| 0.8131944444444444 | 0 |
| 0.813888888888889 | 0 |
| 0.8145833333333333 | 0 |
| 0.8152777777777778 | 0 |
| 0.8159722222222222 | 0 |
| 0.8166666666666668 | 0 |
| 0.8173611111111111 | 0 |
| 0.8180555555555555 | 0 |
| 0.81875 | 0 |
| 0.8194444444444445 | 0 |
| 0.8201388888888889 | 0 |
| 0.8208333333333333 | 0 |
| 0.8215277777777777 | 0 |
| 0.8222222222222223 | 0 |
| 0.8229166666666666 | 0 |
| 0.8236111111111111 | 0 |
| 0.8243055555555556 | 0 |
| 0.8250000000000001 | 0 |
| 0.8256944444444444 | 0 |
| 0.8263888888888888 | 0 |
| 0.8270833333333334 | 0 |
| 0.8277777777777778 | 0 |
| 0.8284722222222222 | 0 |
| 0.8291666666666666 | 0 |
| 0.8298611111111112 | 0 |
| 0.8305555555555556 | 0 |
| 0.8312499999999999 | 0 |
| 0.8319444444444444 | 0 |
| 0.8326388888888889 | 0 |
| 0.8333333333333334 | 0 |
| 0.8340277777777777 | 0 |
| 0.8347222222222223 | 0 |
| 0.8354166666666667 | 0 |
| 0.8361111111111111 | 0 |
| 0.8368055555555555 | 0 |
| 0.8375 | 0 |
| 0.8381944444444445 | 0 |
| 0.8388888888888889 | 0 |
| 0.8395833333333332 | 0 |
| 0.8402777777777778 | 0 |
| 0.8409722222222222 | 0 |
| 0.8416666666666667 | 0 |
| 0.842361111111111 | 0 |
| 0.8430555555555556 | 0 |
| 0.84375 | 0 |
| 0.8444444444444444 | 0 |
| 0.845138888888889 | 0 |
| 0.8458333333333333 | 0 |
| 0.8465277777777778 | 0 |
| 0.8472222222222222 | 0 |
| 0.8479166666666668 | 0 |
| 0.8486111111111111 | 0 |
| 0.8493055555555555 | 0 |
| 0.85 | 0 |
| 0.8506944444444445 | 0 |
| 0.8513888888888889 | 0 |
| 0.8520833333333333 | 0 |
| 0.8527777777777777 | 0 |
| 0.8534722222222223 | 0 |
| 0.8541666666666666 | 0 |
| 0.8548611111111111 | 0 |
| 0.8555555555555556 | 0 |
| 0.8562500000000001 | 0 |
| 0.8569444444444444 | 0 |
| 0.8576388888888888 | 0 |
| 0.8583333333333334 | 0 |
| 0.8590277777777778 | 0 |
| 0.8597222222222222 | 0 |
| 0.8604166666666666 | 0 |
| 0.8611111111111112 | 0 |
| 0.8618055555555556 | 0 |
| 0.8624999999999999 | 0 |
| 0.8631944444444444 | 0 |
| 0.8638888888888889 | 0 |
| 0.8645833333333334 | 0 |
| 0.8652777777777777 | 0 |
| 0.8659722222222223 | 0 |
| 0.8666666666666667 | 0 |
| 0.8673611111111111 | 0 |
| 0.8680555555555555 | 0 |
| 0.86875 | 0 |
| 0.8694444444444445 | 0 |
| 0.8701388888888889 | 0 |
| 0.8708333333333332 | 0 |
| 0.8715277777777778 | 0 |
| 0.8722222222222222 | 0 |
| 0.8729166666666667 | 0 |
| 0.873611111111111 | 0 |
| 0.8743055555555556 | 0 |
| 0.875 | 0 |
| 0.8756944444444444 | 0 |
| 0.876388888888889 | 0 |
| 0.8770833333333333 | 0 |
| 0.8777777777777778 | 0 |
| 0.8784722222222222 | 0 |
| 0.8791666666666668 | 0 |
| 0.8798611111111111 | 0 |
| 0.8805555555555555 | 0 |
| 0.88125 | 0 |
| 0.8819444444444445 | 0 |
| 0.8826388888888889 | 0 |
| 0.8833333333333333 | 0 |
| 0.8840277777777777 | 0 |
| 0.8847222222222223 | 0 |
| 0.8854166666666666 | 0 |
| 0.8861111111111111 | 0 |
| 0.8868055555555556 | 0 |
| 0.8875000000000001 | 0 |
| 0.8881944444444444 | 0 |
| 0.8888888888888888 | 0 |
| 0.8895833333333334 | 0 |
| 0.8902777777777778 | 0 |
| 0.8909722222222222 | 0 |
| 0.8916666666666666 | 0 |
| 0.8923611111111112 | 0 |
| 0.8930555555555556 | 0 |
| 0.8937499999999999 | 0 |
| 0.8944444444444444 | 0 |
| 0.8951388888888889 | 0 |
| 0.8958333333333334 | 0 |
| 0.8965277777777777 | 0 |
| 0.8972222222222223 | 0 |
| 0.8979166666666667 | 0 |
| 0.8986111111111111 | 0 |
| 0.8993055555555555 | 0 |
| 0.9 | 0 |
| 0.9006944444444445 | 0 |
| 0.9013888888888889 | 0 |
| 0.9020833333333332 | 0 |
| 0.9027777777777778 | 0 |
| 0.9034722222222222 | 0 |
| 0.9041666666666667 | 0 |
| 0.904861111111111 | 0 |
| 0.9055555555555556 | 0 |
| 0.90625 | 0 |
| 0.9069444444444444 | 0 |
| 0.907638888888889 | 0 |
| 0.9083333333333333 | 0 |
| 0.9090277777777778 | 0 |
| 0.9097222222222222 | 0 |
| 0.9104166666666668 | 0 |
| 0.9111111111111111 | 0 |
| 0.9118055555555555 | 0 |
| 0.9125 | 0 |
| 0.9131944444444445 | 0 |
| 0.9138888888888889 | 0 |
| 0.9145833333333333 | 0 |
| 0.9152777777777777 | 0 |
| 0.9159722222222223 | 0 |
| 0.9166666666666666 | 0 |
| 0.9173611111111111 | 0 |
| 0.9180555555555556 | 0 |
| 0.9187500000000001 | 0 |
| 0.9194444444444444 | 0 |
| 0.9201388888888888 | 0 |
| 0.9208333333333334 | 0 |
| 0.9215277777777778 | 0 |
| 0.9222222222222222 | 0 |
| 0.9229166666666666 | 0 |
| 0.9236111111111112 | 0 |
| 0.9243055555555556 | 0 |
| 0.9249999999999999 | 0 |
| 0.9256944444444444 | 0 |
| 0.9263888888888889 | 0 |
| 0.9270833333333334 | 0 |
| 0.9277777777777777 | 0 |
| 0.9284722222222223 | 0 |
| 0.9291666666666667 | 0 |
| 0.9298611111111111 | 0 |
| 0.9305555555555555 | 0 |
| 0.93125 | 0 |
| 0.9319444444444445 | 0 |
| 0.9326388888888889 | 0 |
| 0.9333333333333332 | 0 |
| 0.9340277777777778 | 0 |
| 0.9347222222222222 | 0 |
| 0.9354166666666667 | 0 |
| 0.936111111111111 | 0 |
| 0.9368055555555556 | 0 |
| 0.9375 | 0 |
| 0.9381944444444444 | 0 |
| 0.938888888888889 | 0 |
| 0.9395833333333333 | 0 |
| 0.9402777777777778 | 0 |
| 0.9409722222222222 | 0 |
| 0.9416666666666668 | 0 |
| 0.9423611111111111 | 0 |
| 0.9430555555555555 | 0 |
| 0.94375 | 0 |
| 0.9444444444444445 | 0 |
| 0.9451388888888889 | 0 |
| 0.9458333333333333 | 0 |
| 0.9465277777777777 | 0 |
| 0.9472222222222223 | 0 |
| 0.9479166666666666 | 0 |
| 0.9486111111111111 | 0 |
| 0.9493055555555556 | 0 |
| 0.9500000000000001 | 0 |
| 0.9506944444444444 | 0 |
| 0.9513888888888888 | 0 |
| 0.9520833333333334 | 0 |
| 0.9527777777777778 | 0 |
| 0.9534722222222222 | 0 |
| 0.9541666666666666 | 0 |
| 0.9548611111111112 | 0 |
| 0.9555555555555556 | 0 |
| 0.9562499999999999 | 0 |
| 0.9569444444444444 | 0 |
| 0.9576388888888889 | 0 |
| 0.9583333333333334 | 0 |
| 0.9590277777777777 | 0 |
| 0.9597222222222223 | 0 |
| 0.9604166666666667 | 0 |
| 0.9611111111111111 | 0 |
| 0.9618055555555555 | 0 |
| 0.9625 | 0 |
| 0.9631944444444445 | 0 |
| 0.9638888888888889 | 0 |
| 0.9645833333333332 | 0 |
| 0.9652777777777778 | 0 |
| 0.9659722222222222 | 0 |
| 0.9666666666666667 | 0 |
| 0.967361111111111 | 0 |
| 0.9680555555555556 | 0 |
| 0.96875 | 0 |
| 0.9694444444444444 | 0 |
| 0.970138888888889 | 0 |
| 0.9708333333333333 | 0 |
| 0.9715277777777778 | 0 |
| 0.9722222222222222 | 0 |
| 0.9729166666666668 | 0 |
| 0.9736111111111111 | 0 |
| 0.9743055555555555 | 0 |
| 0.975 | 0 |
| 0.9756944444444445 | 0 |
| 0.9763888888888889 | 0 |
| 0.9770833333333333 | 0 |
| 0.9777777777777777 | 0 |
| 0.9784722222222223 | 0 |
| 0.9791666666666666 | 0 |
| 0.9798611111111111 | 0 |
| 0.9805555555555556 | 0 |
| 0.9812500000000001 | 0 |
| 0.9819444444444444 | 0 |
| 0.9826388888888888 | 0 |
| 0.9833333333333334 | 0 |
| 0.9840277777777778 | 0 |
| 0.9847222222222222 | 0 |
| 0.9854166666666666 | 0 |
| 0.9861111111111112 | 0 |
| 0.9868055555555556 | 0 |
| 0.9874999999999999 | 0 |
| 0.9881944444444444 | 0 |
| 0.9888888888888889 | 0 |
| 0.9895833333333334 | 0 |
| 0.9902777777777777 | 0 |
| 0.9909722222222223 | 0 |
| 0.9916666666666667 | 0 |
| 0.9923611111111111 | 0 |
| 0.9930555555555555 | 0 |
| 0.99375 | 0 |
| 0.9944444444444445 | 0 |
| 0.9951388888888889 | 0 |
| 0.9958333333333332 | 0 |
| 0.9965277777777778 | 0 |
| 0.9972222222222222 | 0 |
| 0.9979166666666667 | 0 |
| 0.998611111111111 | 0 |
| 0.9993055555555556 | 0 |